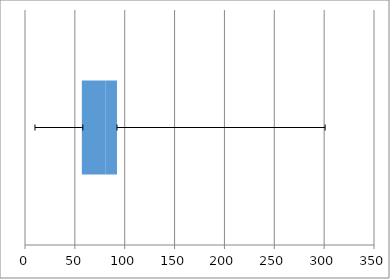
| Category | Series 0 | Series 1 | Series 2 | Series 3 | Series 4 |
|---|---|---|---|---|---|
| 0 | 10 | 47 | 24 | 11.25 | 207.75 |